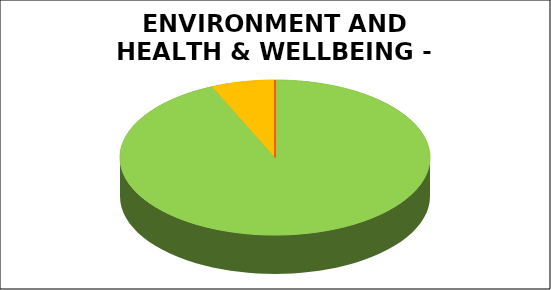
| Category | Series 0 |
|---|---|
| Green | 0.933 |
| Amber | 0.067 |
| Red | 0 |